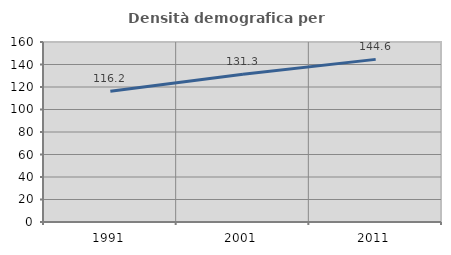
| Category | Densità demografica |
|---|---|
| 1991.0 | 116.212 |
| 2001.0 | 131.286 |
| 2011.0 | 144.557 |